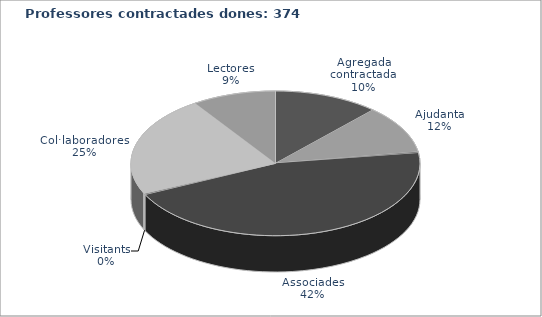
| Category | Agregada/at contractada/at Ajudant/a Catedràtic/a contractat Associades/ats Visitants Col·laboradores/ors  Lectors |
|---|---|
| Agregada/at contractada/at | 44 |
| Ajudant/a | 40 |
| Catedràtic/a contractat | 1 |
| Associades/ats | 169 |
| Visitants | 1 |
| Col·laboradores/ors  | 84 |
| Lectors | 35 |